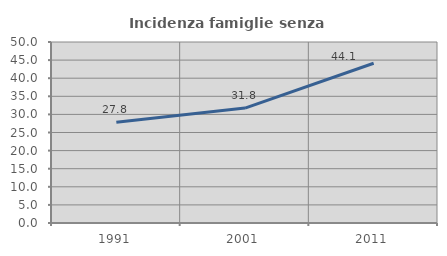
| Category | Incidenza famiglie senza nuclei |
|---|---|
| 1991.0 | 27.835 |
| 2001.0 | 31.754 |
| 2011.0 | 44.125 |